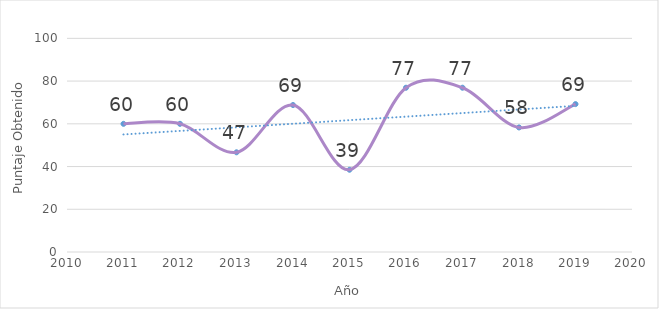
| Category | Recursos humanos |
|---|---|
| 2011.0 | 60 |
| 2012.0 | 60 |
| 2013.0 | 46.67 |
| 2014.0 | 68.8 |
| 2015.0 | 38.5 |
| 2016.0 | 76.9 |
| 2017.0 | 76.9 |
| 2018.0 | 58.3 |
| 2019.0 | 69.23 |